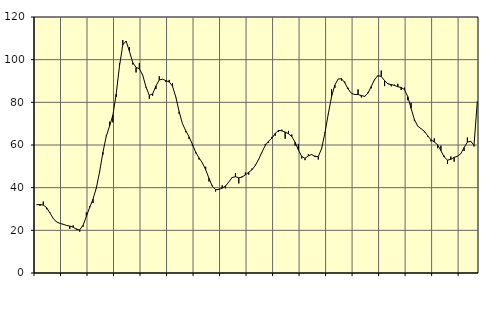
| Category | Piggar | Series 1 |
|---|---|---|
| nan | 31.9 | 32 |
| 87.0 | 31.5 | 32.09 |
| 87.0 | 33.5 | 31.84 |
| 87.0 | 29.9 | 30.66 |
| nan | 28.4 | 28.16 |
| 88.0 | 25.5 | 25.61 |
| 88.0 | 24 | 23.91 |
| 88.0 | 23.2 | 23.28 |
| nan | 23 | 22.83 |
| 89.0 | 22.2 | 22.31 |
| 89.0 | 20.7 | 22 |
| 89.0 | 22.3 | 21.5 |
| nan | 20.8 | 20.48 |
| 90.0 | 19.4 | 20.21 |
| 90.0 | 21.7 | 22.38 |
| 90.0 | 28.4 | 26.5 |
| nan | 31.3 | 30.73 |
| 91.0 | 32.8 | 34.6 |
| 91.0 | 39.6 | 39.81 |
| 91.0 | 47.7 | 47.47 |
| nan | 55.5 | 56.57 |
| 92.0 | 64.4 | 64.08 |
| 92.0 | 70.9 | 68.8 |
| 92.0 | 70.6 | 73.96 |
| nan | 82.6 | 83.82 |
| 93.0 | 98.4 | 97.02 |
| 93.0 | 109.2 | 106.95 |
| 93.0 | 108.5 | 108.73 |
| nan | 105.9 | 103.95 |
| 94.0 | 97.8 | 98.62 |
| 94.0 | 94 | 96.4 |
| 94.0 | 98.4 | 95.74 |
| nan | 92.9 | 92.78 |
| 95.0 | 86.9 | 87.21 |
| 95.0 | 81.6 | 83.26 |
| 95.0 | 83.1 | 83.99 |
| nan | 86.2 | 87.69 |
| 96.0 | 92.2 | 90.52 |
| 96.0 | 90.9 | 90.85 |
| 96.0 | 89.5 | 90.18 |
| nan | 90.5 | 89.58 |
| 97.0 | 89 | 87.57 |
| 97.0 | 82.4 | 82.52 |
| 97.0 | 74.6 | 75.61 |
| nan | 70 | 70.04 |
| 98.0 | 66 | 66.68 |
| 98.0 | 62.8 | 63.81 |
| 98.0 | 59.6 | 60.38 |
| nan | 56.1 | 56.63 |
| 99.0 | 53.2 | 53.98 |
| 99.0 | 51.7 | 51.64 |
| 99.0 | 49.8 | 48.45 |
| nan | 42.9 | 44.41 |
| 0.0 | 41 | 40.71 |
| 0.0 | 38.2 | 39.05 |
| 0.0 | 39.4 | 39.2 |
| nan | 41.1 | 39.79 |
| 1.0 | 39.7 | 40.76 |
| 1.0 | 42.7 | 42.72 |
| 1.0 | 45 | 44.76 |
| nan | 46.8 | 45.15 |
| 2.0 | 42 | 44.59 |
| 2.0 | 45.3 | 44.95 |
| 2.0 | 47.1 | 46.03 |
| nan | 46.1 | 47.2 |
| 3.0 | 49 | 48.44 |
| 3.0 | 50.7 | 50.41 |
| 3.0 | 53.1 | 53.33 |
| nan | 56.6 | 56.67 |
| 4.0 | 60.5 | 59.82 |
| 4.0 | 61.1 | 61.79 |
| 4.0 | 63.8 | 63.26 |
| nan | 64.3 | 65.44 |
| 5.0 | 66.1 | 66.86 |
| 5.0 | 67.2 | 66.67 |
| 5.0 | 62.9 | 66.06 |
| nan | 66.6 | 65.3 |
| 6.0 | 64.9 | 63.93 |
| 6.0 | 59.7 | 61.31 |
| 6.0 | 60.5 | 57.65 |
| nan | 53.7 | 54.65 |
| 7.0 | 52.9 | 53.77 |
| 7.0 | 55.7 | 54.91 |
| 7.0 | 55.3 | 55.53 |
| nan | 55 | 54.56 |
| 8.0 | 53.2 | 54.61 |
| 8.0 | 58.5 | 58.33 |
| 8.0 | 65.9 | 65.66 |
| nan | 74.3 | 74.46 |
| 9.0 | 86.1 | 82.71 |
| 9.0 | 86.8 | 88.13 |
| 9.0 | 90.9 | 90.91 |
| nan | 90.2 | 91.11 |
| 10.0 | 89.7 | 89.18 |
| 10.0 | 86.8 | 86.23 |
| 10.0 | 84.2 | 84.2 |
| nan | 83.6 | 83.7 |
| 11.0 | 86.1 | 83.67 |
| 11.0 | 82.3 | 83.16 |
| 11.0 | 82.6 | 82.81 |
| nan | 84.7 | 84.33 |
| 12.0 | 86.6 | 87.48 |
| 12.0 | 90.4 | 90.74 |
| 12.0 | 92.2 | 92.57 |
| nan | 94.9 | 92.12 |
| 13.0 | 87.6 | 90.18 |
| 13.0 | 89 | 88.63 |
| 13.0 | 87.5 | 88.33 |
| nan | 88.3 | 87.91 |
| 14.0 | 88.7 | 87.3 |
| 14.0 | 85.8 | 86.97 |
| 14.0 | 86.9 | 86 |
| nan | 81 | 82.68 |
| 15.0 | 79.8 | 77.2 |
| 15.0 | 71.3 | 71.93 |
| 15.0 | 68.8 | 68.85 |
| nan | 67.6 | 67.69 |
| 16.0 | 66 | 66.44 |
| 16.0 | 64 | 64.38 |
| 16.0 | 61.7 | 62.45 |
| nan | 63.1 | 61.42 |
| 17.0 | 58.5 | 60.12 |
| 17.0 | 59.7 | 57.32 |
| 17.0 | 55 | 54.37 |
| nan | 51.1 | 52.93 |
| 18.0 | 54.6 | 53.25 |
| 18.0 | 52.2 | 54.25 |
| 18.0 | 54.6 | 54.7 |
| nan | 56 | 55.9 |
| 19.0 | 57.2 | 58.79 |
| 19.0 | 63.5 | 61.37 |
| 19.0 | 61.5 | 61.72 |
| nan | 59.3 | 59.88 |
| 20.0 | 80.5 | 80.52 |